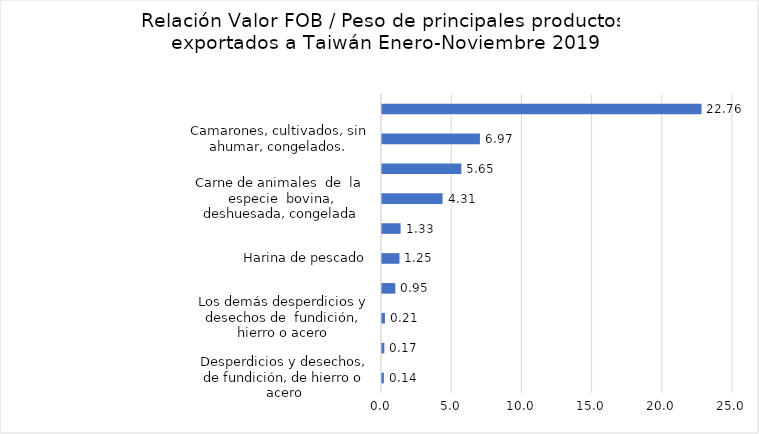
| Category | Series 0 |
|---|---|
| Desperdicios y desechos, de fundición, de hierro o acero | 0.137 |
| Desperdicios y desechos de hierro o de acero, estañados | 0.168 |
| Los demás desperdicios y desechos de  fundición, hierro o acero | 0.209 |
| Despojos comestibles  de  animales de  la  especie  bovina, frescos o refrigerados | 0.949 |
| Harina de pescado | 1.245 |
| Desperdicios y desechos, de aluminio | 1.326 |
| Carne de animales  de  la  especie  bovina, deshuesada, congelada | 4.313 |
| Camarones  y  langostinos,  de  agua  fría, congelados, excepto ahumados | 5.65 |
| Camarones, cultivados, sin ahumar, congelados. | 6.974 |
| Café tostado, descafeinado | 22.756 |